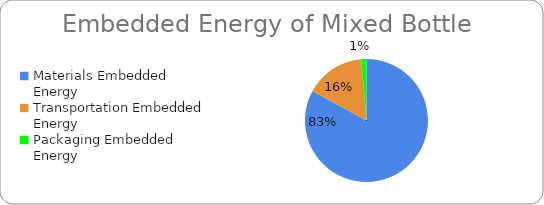
| Category | Series 0 |
|---|---|
| Materials Embedded Energy | 0.454 |
| Transportation Embedded Energy | 0.086 |
| Packaging Embedded Energy | 0.007 |